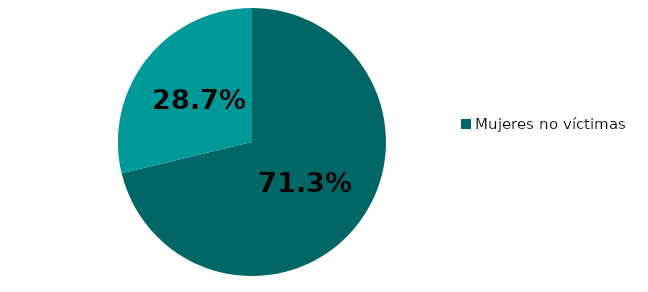
| Category | % sobre mujeres que han tenido pareja alguna vez |
|---|---|
| Mujeres no víctimas | 71.256 |
| Mujeres víctimas | 28.744 |